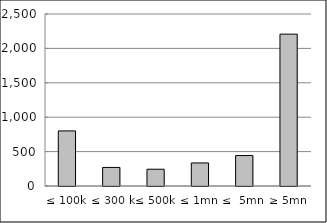
| Category | Series 0 |
|---|---|
| ≤ 100k | 800795620.395 |
| ≤ 300 k | 269838553.784 |
| ≤ 500k | 243836207.2 |
| ≤ 1mn | 334983818.09 |
| ≤  5mn | 442570203.271 |
| ≥ 5mn | 2207128407.721 |